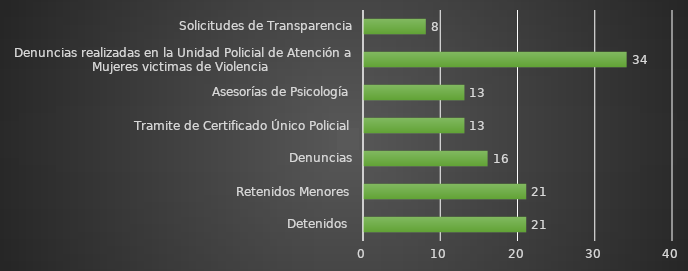
| Category | INDICADOR  |
|---|---|
| Detenidos  | 21 |
| Retenidos Menores | 21 |
| Denuncias | 16 |
| Tramite de Certificado Único Policial | 13 |
| Asesorías de Psicología | 13 |
| Denuncias realizadas en la Unidad Policial de Atención a Mujeres victimas de Violencia  | 34 |
| Solicitudes de Transparencia | 8 |